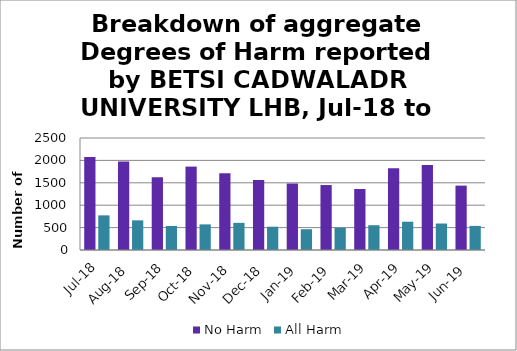
| Category | No Harm | All Harm |
|---|---|---|
| Jul-18 | 2074 | 773 |
| Aug-18 | 1978 | 662 |
| Sep-18 | 1624 | 537 |
| Oct-18 | 1862 | 572 |
| Nov-18 | 1713 | 606 |
| Dec-18 | 1564 | 520 |
| Jan-19 | 1484 | 464 |
| Feb-19 | 1450 | 497 |
| Mar-19 | 1361 | 553 |
| Apr-19 | 1827 | 631 |
| May-19 | 1899 | 591 |
| Jun-19 | 1437 | 538 |